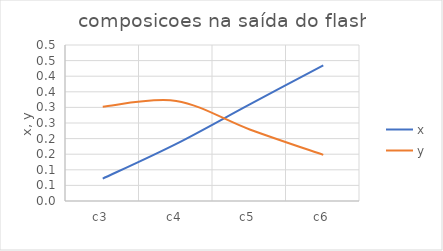
| Category |  x  |  y  |
|---|---|---|
| c3 | 0.072 | 0.302 |
| c4 | 0.183 | 0.321 |
| c5 | 0.31 | 0.229 |
| c6 | 0.435 | 0.148 |